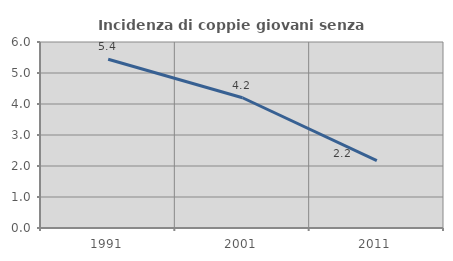
| Category | Incidenza di coppie giovani senza figli |
|---|---|
| 1991.0 | 5.444 |
| 2001.0 | 4.202 |
| 2011.0 | 2.174 |